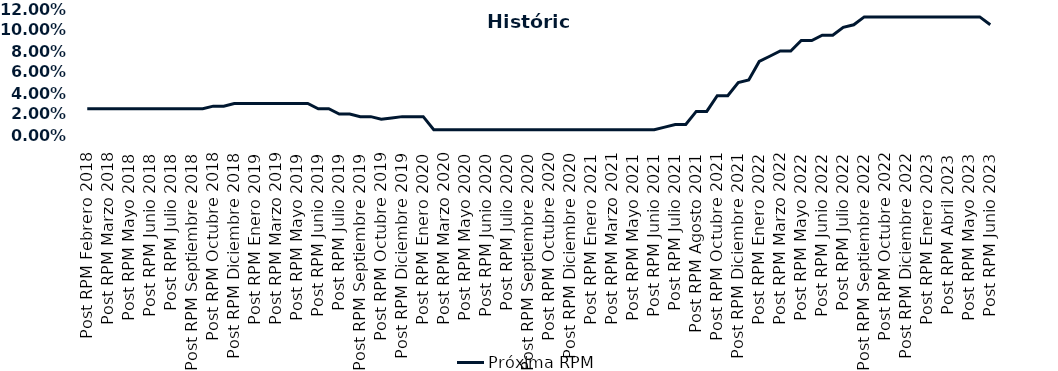
| Category | Próxima RPM |
|---|---|
| Post RPM Febrero 2018 | 0.025 |
| Pre RPM Marzo 2018 | 0.025 |
| Post RPM Marzo 2018 | 0.025 |
| Pre RPM Mayo 2018 | 0.025 |
| Post RPM Mayo 2018 | 0.025 |
| Pre RPM Junio 2018 | 0.025 |
| Post RPM Junio 2018 | 0.025 |
| Pre RPM Julio 2018 | 0.025 |
| Post RPM Julio 2018 | 0.025 |
| Pre RPM Septiembre 2018 | 0.025 |
| Post RPM Septiembre 2018 | 0.025 |
| Pre RPM Octubre 2018 | 0.025 |
| Post RPM Octubre 2018 | 0.028 |
| Pre RPM Diciembre 2018 | 0.028 |
| Post RPM Diciembre 2018 | 0.03 |
| Pre RPM Enero 2019 | 0.03 |
| Post RPM Enero 2019 | 0.03 |
| Pre RPM Marzo 2019 | 0.03 |
| Post RPM Marzo 2019 | 0.03 |
| Pre RPM Mayo 2019 | 0.03 |
| Post RPM Mayo 2019 | 0.03 |
| Pre RPM Junio 2019 | 0.03 |
| Post RPM Junio 2019 | 0.025 |
| Pre RPM Julio 2019 | 0.025 |
| Post RPM Julio 2019 | 0.02 |
| Pre RPM Septiembre 2019 | 0.02 |
| Post RPM Septiembre 2019 | 0.018 |
| Pre RPM Octubre 2019 | 0.018 |
| Post RPM Octubre 2019 | 0.015 |
| Pre RPM Diciembre 2019 | 0.016 |
| Post RPM Diciembre 2019 | 0.018 |
| Pre RPM Enero 2020 | 0.018 |
| Post RPM Enero 2020 | 0.018 |
| Pre RPM Marzo 2020 | 0.005 |
| Post RPM Marzo 2020 | 0.005 |
| Pre RPM Mayo 2020 | 0.005 |
| Post RPM Mayo 2020 | 0.005 |
| Pre RPM Junio 2020 | 0.005 |
| Post RPM Junio 2020 | 0.005 |
| Pre RPM Julio 2020 | 0.005 |
| Post RPM Julio 2020 | 0.005 |
| Pre RPM Septiembre 2020 | 0.005 |
| Post RPM Septiembre 2020 | 0.005 |
| Pre RPM Octubre 2020 | 0.005 |
| Post RPM Octubre 2020 | 0.005 |
| Pre RPM Diciembre 2020 | 0.005 |
| Post RPM Diciembre 2020 | 0.005 |
| Pre RPM Enero 2021 | 0.005 |
| Post RPM Enero 2021 | 0.005 |
| Pre RPM Marzo 2021 | 0.005 |
| Post RPM Marzo 2021 | 0.005 |
| Pre RPM Mayo 2021 | 0.005 |
| Post RPM Mayo 2021 | 0.005 |
| Pre RPM Junio 2021 | 0.005 |
| Post RPM Junio 2021 | 0.005 |
| Pre RPM Julio 2021 | 0.008 |
| Post RPM Julio 2021 | 0.01 |
| Pre RPM Agosto 2021 | 0.01 |
| Post RPM Agosto 2021 | 0.022 |
| Pre RPM Octubre 2021 | 0.022 |
| Post RPM Octubre 2021 | 0.038 |
| Pre RPM Diciembre 2021 | 0.038 |
| Post RPM Diciembre 2021 | 0.05 |
| Pre RPM Enero 2022 | 0.052 |
| Post RPM Enero 2022 | 0.07 |
| Pre RPM Marzo 2022 | 0.075 |
| Post RPM Marzo 2022 | 0.08 |
| Pre RPM Mayo 2022 | 0.08 |
| Post RPM Mayo 2022 | 0.09 |
| Pre RPM Junio 2022 | 0.09 |
| Post RPM Junio 2022 | 0.095 |
| Pre RPM Julio 2022 | 0.095 |
| Post RPM Julio 2022 | 0.102 |
| Pre RPM Septiembre 2022 | 0.105 |
| Post RPM Septiembre 2022 | 0.112 |
| Pre RPM Octubre 2022 | 0.112 |
| Post RPM Octubre 2022 | 0.112 |
| Pre RPM Diciembre 2022 | 0.112 |
| Post RPM Diciembre 2022 | 0.112 |
| Pre RPM Enero 2023 | 0.112 |
| Post RPM Enero 2023 | 0.112 |
| Pre RPM Abril 2023 | 0.112 |
| Post RPM Abril 2023 | 0.112 |
| Pre RPM Mayo 2023 | 0.112 |
| Post RPM Mayo 2023 | 0.112 |
| Pre RPM Junio 2023 | 0.112 |
| Post RPM Junio 2023 | 0.105 |